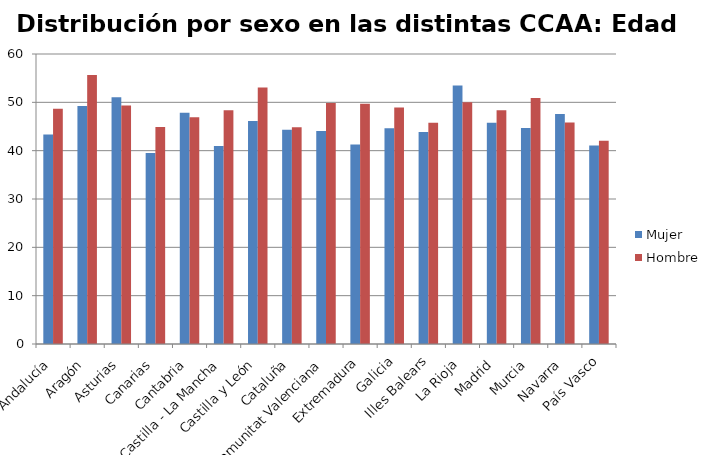
| Category | Mujer | Hombre |
|---|---|---|
| Andalucía | 43.32 | 48.67 |
| Aragón | 49.24 | 55.68 |
| Asturias | 51.03 | 49.32 |
| Canarias | 39.51 | 44.88 |
| Cantabria | 47.83 | 46.9 |
| Castilla - La Mancha | 40.95 | 48.38 |
| Castilla y León | 46.14 | 53.08 |
| Cataluña | 44.32 | 44.85 |
| Comunitat Valenciana | 44.05 | 49.88 |
| Extremadura | 41.26 | 49.7 |
| Galicia | 44.65 | 48.95 |
| Illes Balears | 43.86 | 45.77 |
| La Rioja | 53.5 | 50 |
| Madrid | 45.8 | 48.38 |
| Murcia | 44.67 | 50.88 |
| Navarra | 47.6 | 45.83 |
| País Vasco | 41.06 | 42.04 |